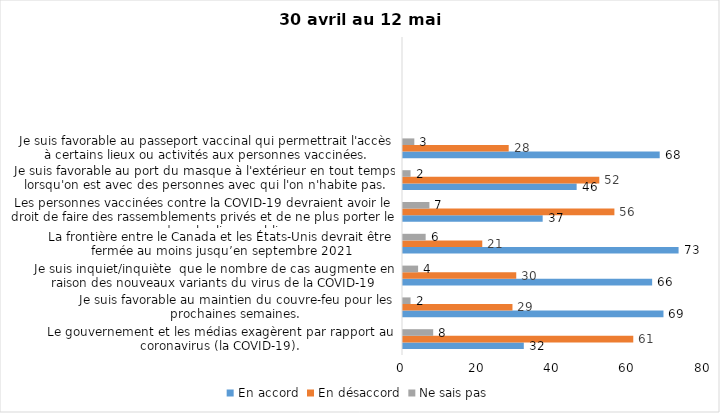
| Category | En accord | En désaccord | Ne sais pas |
|---|---|---|---|
| Le gouvernement et les médias exagèrent par rapport au coronavirus (la COVID-19). | 32 | 61 | 8 |
| Je suis favorable au maintien du couvre-feu pour les prochaines semaines. | 69 | 29 | 2 |
| Je suis inquiet/inquiète  que le nombre de cas augmente en raison des nouveaux variants du virus de la COVID-19 | 66 | 30 | 4 |
| La frontière entre le Canada et les États-Unis devrait être fermée au moins jusqu’en septembre 2021 | 73 | 21 | 6 |
| Les personnes vaccinées contre la COVID-19 devraient avoir le droit de faire des rassemblements privés et de ne plus porter le masque dans les lieux publics. | 37 | 56 | 7 |
| Je suis favorable au port du masque à l'extérieur en tout temps lorsqu'on est avec des personnes avec qui l'on n'habite pas. | 46 | 52 | 2 |
| Je suis favorable au passeport vaccinal qui permettrait l'accès à certains lieux ou activités aux personnes vaccinées. | 68 | 28 | 3 |